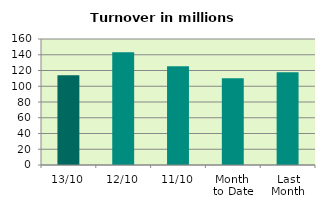
| Category | Series 0 |
|---|---|
| 13/10 | 113.935 |
| 12/10 | 143.04 |
| 11/10 | 125.444 |
| Month 
to Date | 110.128 |
| Last
Month | 117.918 |